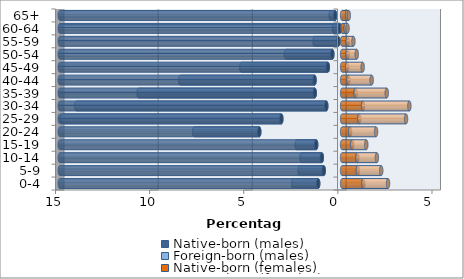
| Category | Native-born (males) | Foreign-born (males) | Native-born (females) | Foreign-born (females) |
|---|---|---|---|---|
| 0-4 | -1.272 | -1.328 | 1.128 | 1.31 |
| 5-9 | -0.977 | -1.284 | 0.835 | 1.241 |
| 10-14 | -1.079 | -1.076 | 0.813 | 1.035 |
| 15-19 | -1.379 | -1.028 | 0.535 | 0.749 |
| 20-24 | -4.402 | -3.458 | 0.421 | 1.382 |
| 25-29 | -3.229 | -11.64 | 0.91 | 2.487 |
| 30-34 | -0.842 | -13.282 | 1.109 | 2.463 |
| 35-39 | -1.454 | -9.358 | 0.717 | 1.654 |
| 40-44 | -1.464 | -7.141 | 0.33 | 1.24 |
| 45-49 | -0.758 | -4.597 | 0.269 | 0.823 |
| 50-54 | -0.521 | -2.467 | 0.294 | 0.482 |
| 55-59 | -0.204 | -1.256 | 0.297 | 0.303 |
| 60-64 | -0.12 | -0.311 | 0.189 | 0.099 |
| 65+ | -0.369 | -0.232 | 0.26 | 0.094 |